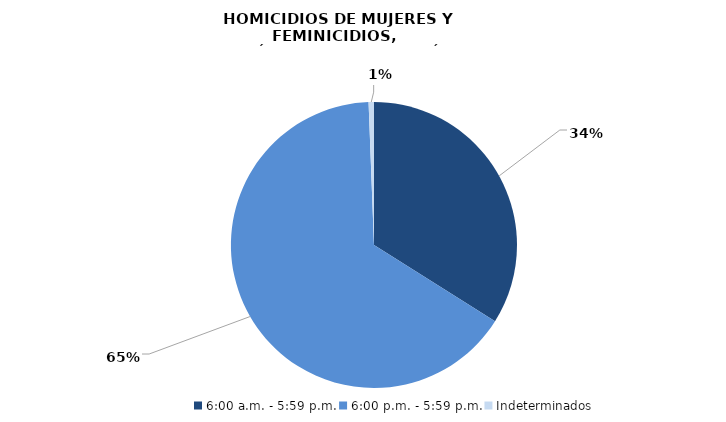
| Category | Series 0 |
|---|---|
| 6:00 a.m. - 5:59 p.m. | 56 |
| 6:00 p.m. - 5:59 p.m. | 108 |
| Indeterminados | 1 |